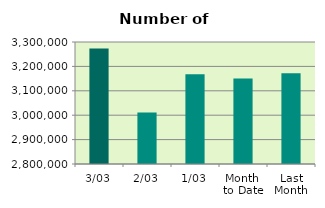
| Category | Series 0 |
|---|---|
| 3/03 | 3273090 |
| 2/03 | 3010654 |
| 1/03 | 3167778 |
| Month 
to Date | 3150507.333 |
| Last
Month | 3172414.4 |